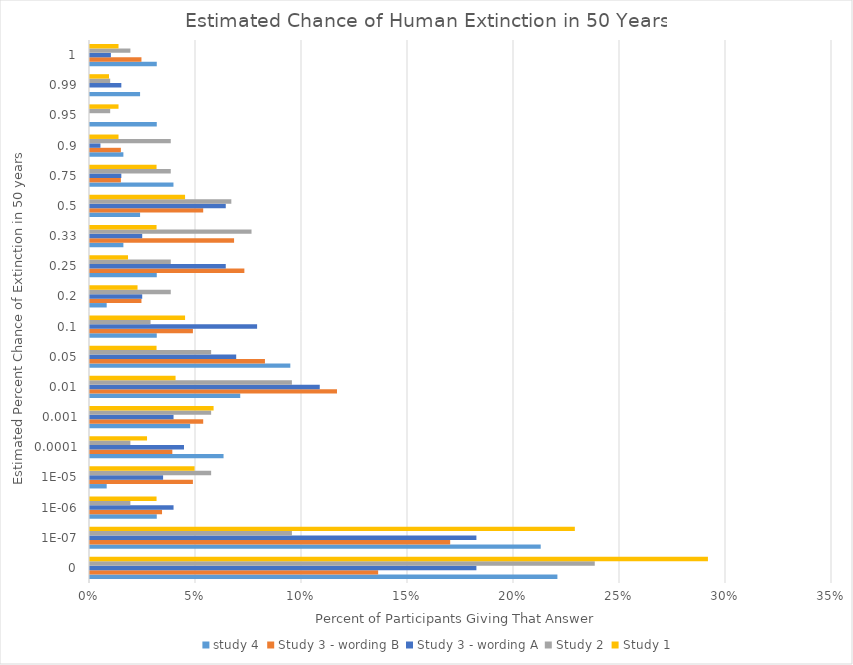
| Category | study 4 | Study 3 - wording B | Study 3 - wording A | Study 2 | Study 1 |
|---|---|---|---|---|---|
| 0.0 | 0.22 | 0.136 | 0.182 | 0.238 | 0.291 |
| 1e-07 | 0.213 | 0.17 | 0.182 | 0.095 | 0.229 |
| 1e-06 | 0.031 | 0.034 | 0.039 | 0.019 | 0.031 |
| 1e-05 | 0.008 | 0.049 | 0.034 | 0.057 | 0.049 |
| 0.0001 | 0.063 | 0.039 | 0.044 | 0.019 | 0.027 |
| 0.001 | 0.047 | 0.053 | 0.039 | 0.057 | 0.058 |
| 0.01 | 0.071 | 0.117 | 0.108 | 0.095 | 0.04 |
| 0.05 | 0.094 | 0.083 | 0.069 | 0.057 | 0.031 |
| 0.1 | 0.031 | 0.049 | 0.079 | 0.029 | 0.045 |
| 0.2 | 0.008 | 0.024 | 0.025 | 0.038 | 0.022 |
| 0.25 | 0.031 | 0.073 | 0.064 | 0.038 | 0.018 |
| 0.33 | 0.016 | 0.068 | 0.025 | 0.076 | 0.031 |
| 0.5 | 0.024 | 0.053 | 0.064 | 0.067 | 0.045 |
| 0.75 | 0.039 | 0.015 | 0.015 | 0.038 | 0.031 |
| 0.9 | 0.016 | 0.015 | 0.005 | 0.038 | 0.013 |
| 0.95 | 0.031 | 0 | 0 | 0.01 | 0.013 |
| 0.99 | 0.024 | 0 | 0.015 | 0.01 | 0.009 |
| 1.0 | 0.031 | 0.024 | 0.01 | 0.019 | 0.013 |